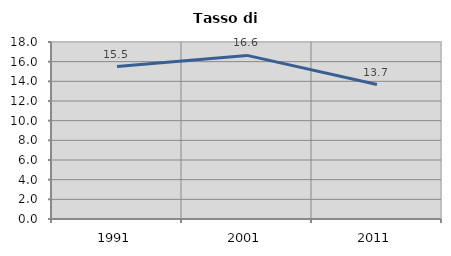
| Category | Tasso di disoccupazione   |
|---|---|
| 1991.0 | 15.497 |
| 2001.0 | 16.637 |
| 2011.0 | 13.67 |